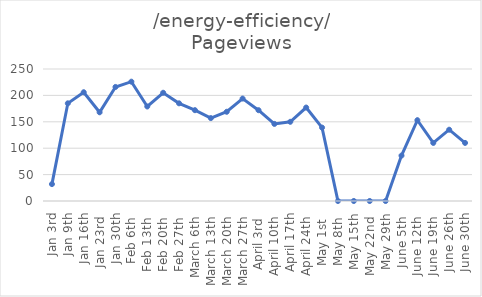
| Category | Pageviews |
|---|---|
| Jan 3rd | 32 |
| Jan 9th | 185 |
| Jan 16th | 206 |
| Jan 23rd  | 168 |
| Jan 30th | 216 |
| Feb 6th  | 226 |
| Feb 13th  | 179 |
| Feb 20th  | 205 |
| Feb 27th  | 185 |
| March 6th  | 172 |
| March 13th  | 157 |
| March 20th  | 169 |
| March 27th  | 194 |
| April 3rd  | 172 |
| April 10th  | 146 |
| April 17th | 150 |
| April 24th  | 177 |
| May 1st  | 139 |
| May 8th  | 0 |
| May 15th | 0 |
| May 22nd  | 0 |
| May 29th | 0 |
| June 5th  | 86 |
| June 12th  | 153 |
| June 19th  | 110 |
| June 26th | 135 |
| June 30th | 110 |